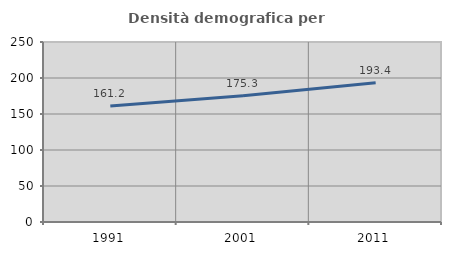
| Category | Densità demografica |
|---|---|
| 1991.0 | 161.195 |
| 2001.0 | 175.335 |
| 2011.0 | 193.45 |